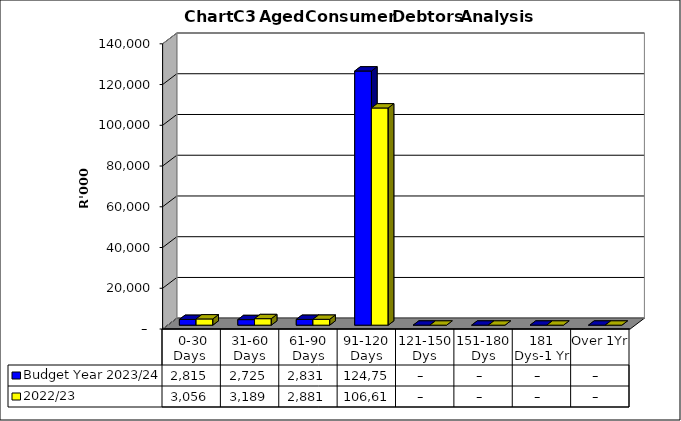
| Category | Budget Year 2023/24 | 2022/23 |
|---|---|---|
|  0-30 Days  | 2815403 | 3055532 |
| 31-60 Days | 2724613 | 3189233 |
| 61-90 Days | 2830574 | 2880891 |
| 91-120 Days | 124757882 | 106616270 |
| 121-150 Dys | 0 | 0 |
| 151-180 Dys | 0 | 0 |
| 181 Dys-1 Yr | 0 | 0 |
| Over 1Yr | 0 | 0 |